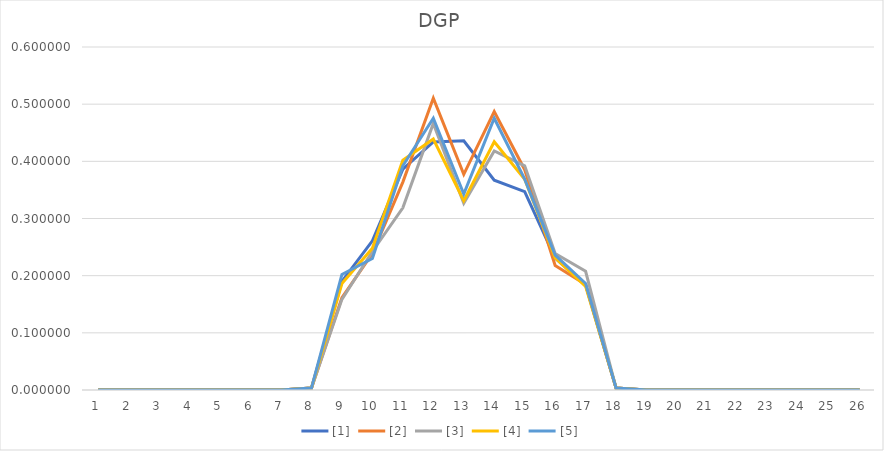
| Category | [1] | [2] | [3] | [4] | [5] |
|---|---|---|---|---|---|
| 0 | 0 | 0 | 0 | 0 | 0 |
| 1 | 0 | 0 | 0 | 0 | 0 |
| 2 | 0 | 0 | 0 | 0 | 0 |
| 3 | 0 | 0 | 0 | 0 | 0 |
| 4 | 0 | 0 | 0 | 0 | 0 |
| 5 | 0 | 0 | 0 | 0 | 0 |
| 6 | 0 | 0 | 0 | 0 | 0 |
| 7 | 0.003 | 0.003 | 0.003 | 0.003 | 0.003 |
| 8 | 0.19 | 0.161 | 0.159 | 0.186 | 0.202 |
| 9 | 0.261 | 0.239 | 0.242 | 0.248 | 0.23 |
| 10 | 0.386 | 0.364 | 0.319 | 0.402 | 0.392 |
| 11 | 0.434 | 0.51 | 0.466 | 0.439 | 0.475 |
| 12 | 0.436 | 0.377 | 0.327 | 0.331 | 0.343 |
| 13 | 0.367 | 0.487 | 0.418 | 0.434 | 0.475 |
| 14 | 0.347 | 0.385 | 0.392 | 0.369 | 0.369 |
| 15 | 0.231 | 0.218 | 0.239 | 0.231 | 0.236 |
| 16 | 0.184 | 0.185 | 0.208 | 0.181 | 0.186 |
| 17 | 0.003 | 0.003 | 0.003 | 0.003 | 0.003 |
| 18 | 0 | 0 | 0 | 0 | 0 |
| 19 | 0 | 0 | 0 | 0 | 0 |
| 20 | 0 | 0 | 0 | 0 | 0 |
| 21 | 0 | 0 | 0 | 0 | 0 |
| 22 | 0 | 0 | 0 | 0 | 0 |
| 23 | 0 | 0 | 0 | 0 | 0 |
| 24 | 0 | 0 | 0 | 0 | 0 |
| 25 | 0 | 0 | 0 | 0 | 0 |